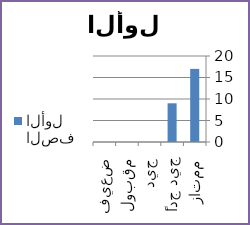
| Category | الصف الأول |
|---|---|
| ممتاز | 17 |
| جيد جداً | 9 |
| جيد | 0 |
| مقبول | 0 |
| ضعيف | 0 |